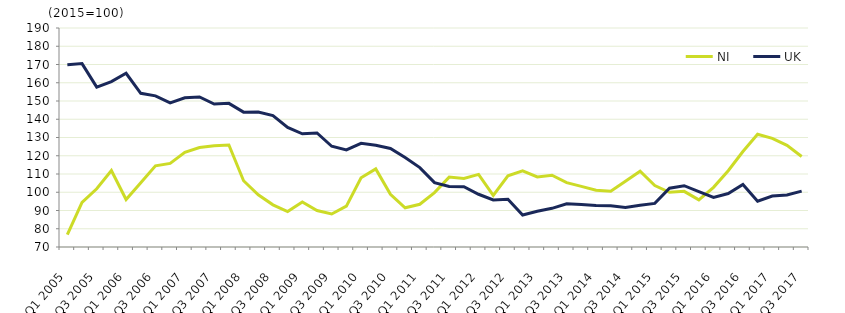
| Category | NI  | UK  |
|---|---|---|
| Q1 2005 | 76.8 | 169.9 |
|  | 94.4 | 170.5 |
| Q3 2005 | 101.9 | 157.6 |
|  | 111.9 | 160.6 |
| Q1 2006 | 96 | 165.2 |
|  | 105.2 | 154.2 |
| Q3 2006 | 114.5 | 152.8 |
|  | 115.8 | 149 |
| Q1 2007 | 121.9 | 151.8 |
|  | 124.5 | 152.2 |
| Q3 2007 | 125.5 | 148.3 |
|  | 125.9 | 148.7 |
| Q1 2008 | 106.3 | 143.9 |
|  | 98.6 | 144 |
| Q3 2008 | 93.1 | 142 |
|  | 89.4 | 135.5 |
| Q1 2009 | 94.7 | 132 |
|  | 90 | 132.5 |
| Q3 2009 | 88.1 | 125.2 |
|  | 92.4 | 123.2 |
| Q1 2010 | 107.9 | 126.8 |
|  | 112.8 | 125.7 |
| Q3 2010 | 98.9 | 124 |
|  | 91.5 | 119 |
| Q1 2011 | 93.4 | 113.5 |
|  | 99.8 | 105.3 |
| Q3 2011 | 108.3 | 103.2 |
|  | 107.6 | 103 |
| Q1 2012 | 109.8 | 98.9 |
|  | 98.3 | 95.8 |
| Q3 2012 | 109 | 96.2 |
|  | 111.7 | 87.5 |
| Q1 2013 | 108.4 | 89.6 |
|  | 109.3 | 91.2 |
| Q3 2013 | 105.3 | 93.7 |
|  | 103.2 | 93.3 |
| Q1 2014 | 101.1 | 92.7 |
|  | 100.5 | 92.6 |
| Q3 2014 | 106 | 91.6 |
|  | 111.5 | 92.9 |
| Q1 2015 | 103.7 | 93.9 |
|  | 100 | 102.2 |
| Q3 2015 | 100.5 | 103.6 |
|  | 95.8 | 100.3 |
| Q1 2016 | 102.7 | 97.2 |
|  | 111.8 | 99.3 |
| Q3 2016 | 122.3 | 104.3 |
|  | 131.8 | 95.1 |
| Q1 2017 | 129.5 | 97.9 |
|  | 125.7 | 98.5 |
| Q3 2017 | 119.6 | 100.6 |